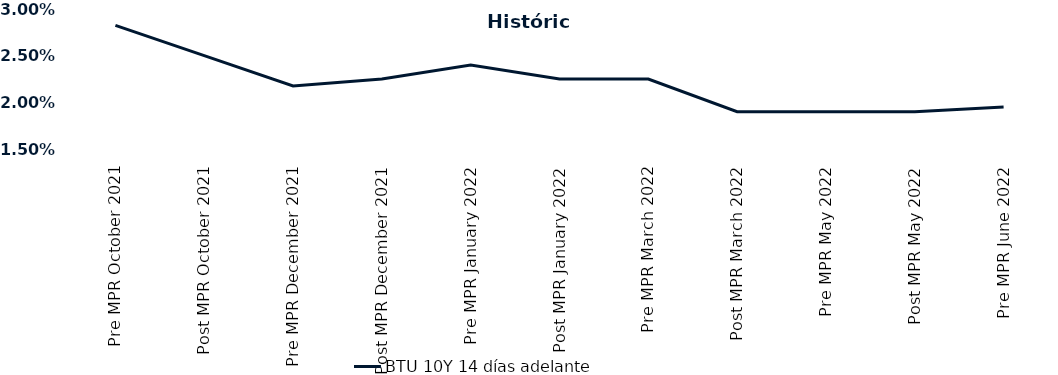
| Category | BTU 10Y 14 días adelante |
|---|---|
| Pre MPR October 2021 | 0.028 |
| Post MPR October 2021 | 0.025 |
| Pre MPR December 2021 | 0.022 |
| Post MPR December 2021 | 0.022 |
| Pre MPR January 2022 | 0.024 |
| Post MPR January 2022 | 0.022 |
| Pre MPR March 2022 | 0.022 |
| Post MPR March 2022 | 0.019 |
| Pre MPR May 2022 | 0.019 |
| Post MPR May 2022 | 0.019 |
| Pre MPR June 2022 | 0.02 |